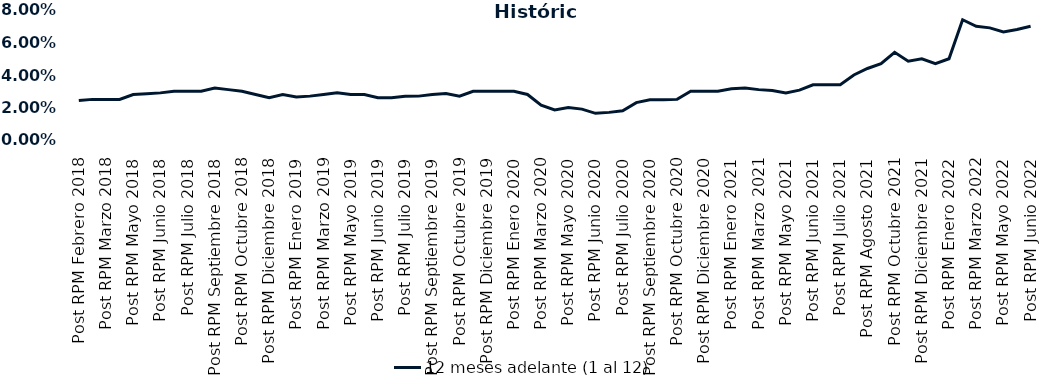
| Category | 12 meses adelante (1 al 12)  |
|---|---|
| Post RPM Febrero 2018 | 0.024 |
| Pre RPM Marzo 2018 | 0.025 |
| Post RPM Marzo 2018 | 0.025 |
| Pre RPM Mayo 2018 | 0.025 |
| Post RPM Mayo 2018 | 0.028 |
| Pre RPM Junio 2018 | 0.028 |
| Post RPM Junio 2018 | 0.029 |
| Pre RPM Julio 2018 | 0.03 |
| Post RPM Julio 2018 | 0.03 |
| Pre RPM Septiembre 2018 | 0.03 |
| Post RPM Septiembre 2018 | 0.032 |
| Pre RPM Octubre 2018 | 0.031 |
| Post RPM Octubre 2018 | 0.03 |
| Pre RPM Diciembre 2018 | 0.028 |
| Post RPM Diciembre 2018 | 0.026 |
| Pre RPM Enero 2019 | 0.028 |
| Post RPM Enero 2019 | 0.026 |
| Pre RPM Marzo 2019 | 0.027 |
| Post RPM Marzo 2019 | 0.028 |
| Pre RPM Mayo 2019 | 0.029 |
| Post RPM Mayo 2019 | 0.028 |
| Pre RPM Junio 2019 | 0.028 |
| Post RPM Junio 2019 | 0.026 |
| Pre RPM Julio 2019 | 0.026 |
| Post RPM Julio 2019 | 0.027 |
| Pre RPM Septiembre 2019 | 0.027 |
| Post RPM Septiembre 2019 | 0.028 |
| Pre RPM Octubre 2019 | 0.029 |
| Post RPM Octubre 2019 | 0.027 |
| Pre RPM Diciembre 2019 | 0.03 |
| Post RPM Diciembre 2019 | 0.03 |
| Pre RPM Enero 2020 | 0.03 |
| Post RPM Enero 2020 | 0.03 |
| Pre RPM Marzo 2020 | 0.028 |
| Post RPM Marzo 2020 | 0.022 |
| Pre RPM Mayo 2020 | 0.018 |
| Post RPM Mayo 2020 | 0.02 |
| Pre RPM Junio 2020 | 0.019 |
| Post RPM Junio 2020 | 0.016 |
| Pre RPM Julio 2020 | 0.017 |
| Post RPM Julio 2020 | 0.018 |
| Pre RPM Septiembre 2020 | 0.023 |
| Post RPM Septiembre 2020 | 0.025 |
| Pre RPM Octubre 2020 | 0.025 |
| Post RPM Octubre 2020 | 0.025 |
| Pre RPM Diciembre 2020 | 0.03 |
| Post RPM Diciembre 2020 | 0.03 |
| Pre RPM Enero 2021 | 0.03 |
| Post RPM Enero 2021 | 0.032 |
| Pre RPM Marzo 2021 | 0.032 |
| Post RPM Marzo 2021 | 0.031 |
| Pre RPM Mayo 2021 | 0.03 |
| Post RPM Mayo 2021 | 0.029 |
| Pre RPM Junio 2021 | 0.031 |
| Post RPM Junio 2021 | 0.034 |
| Pre RPM Julio 2021 | 0.034 |
| Post RPM Julio 2021 | 0.034 |
| Pre RPM Agosto 2021 | 0.04 |
| Post RPM Agosto 2021 | 0.044 |
| Pre RPM Octubre 2021 | 0.047 |
| Post RPM Octubre 2021 | 0.054 |
| Pre RPM Diciembre 2021 | 0.048 |
| Post RPM Diciembre 2021 | 0.05 |
| Pre RPM Enero 2022 | 0.047 |
| Post RPM Enero 2022 | 0.05 |
| Pre RPM Marzo 2022 | 0.074 |
| Post RPM Marzo 2022 | 0.07 |
| Pre RPM Mayo 2022 | 0.069 |
| Post RPM Mayo 2022 | 0.066 |
| Pre RPM Junio 2022 | 0.068 |
| Post RPM Junio 2022 | 0.07 |